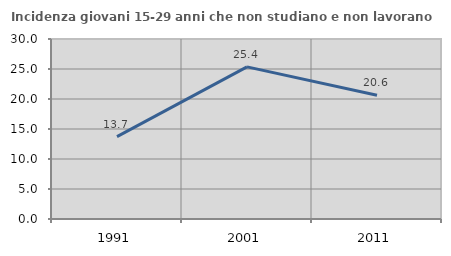
| Category | Incidenza giovani 15-29 anni che non studiano e non lavorano  |
|---|---|
| 1991.0 | 13.74 |
| 2001.0 | 25.357 |
| 2011.0 | 20.635 |